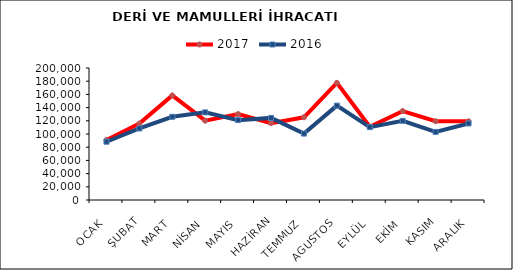
| Category | 2017 | 2016 |
|---|---|---|
| OCAK | 90876.831 | 88262.647 |
| ŞUBAT | 115889.048 | 108392.155 |
| MART | 158449.08 | 126075.644 |
| NİSAN | 120142.944 | 132778.815 |
| MAYIS | 130178.749 | 121029.346 |
| HAZİRAN | 116501.839 | 124400.226 |
| TEMMUZ | 125322.109 | 100638.919 |
| AGUSTOS | 177467.269 | 143008.281 |
| EYLÜL | 111023.788 | 110363.2 |
| EKİM | 134722.617 | 119984.006 |
| KASIM | 119402.145 | 103157.598 |
| ARALIK | 119255.063 | 115969.712 |